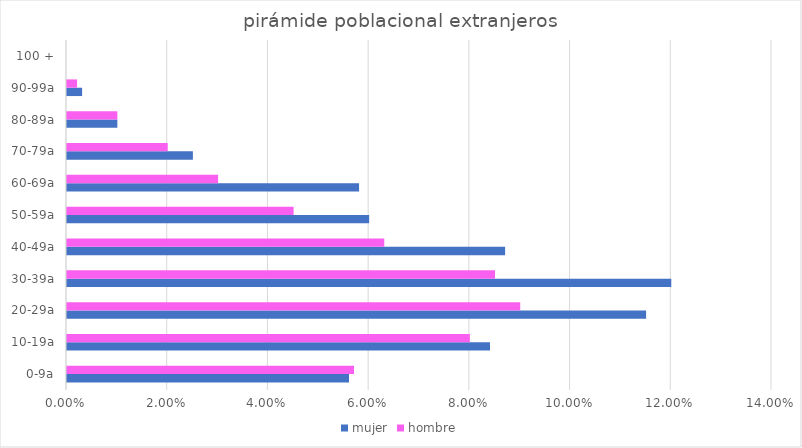
| Category | mujer | hombre |
|---|---|---|
| 0-9a | 0.056 | 0.057 |
| 10-19a | 0.084 | 0.08 |
| 20-29a | 0.115 | 0.09 |
| 30-39a | 0.12 | 0.085 |
| 40-49a | 0.087 | 0.063 |
| 50-59a | 0.06 | 0.045 |
| 60-69a | 0.058 | 0.03 |
| 70-79a | 0.025 | 0.02 |
| 80-89a | 0.01 | 0.01 |
| 90-99a | 0.003 | 0.002 |
| 100 + | 0 | 0 |